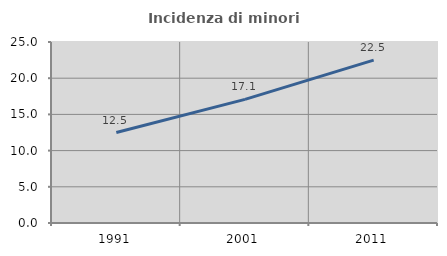
| Category | Incidenza di minori stranieri |
|---|---|
| 1991.0 | 12.5 |
| 2001.0 | 17.073 |
| 2011.0 | 22.5 |